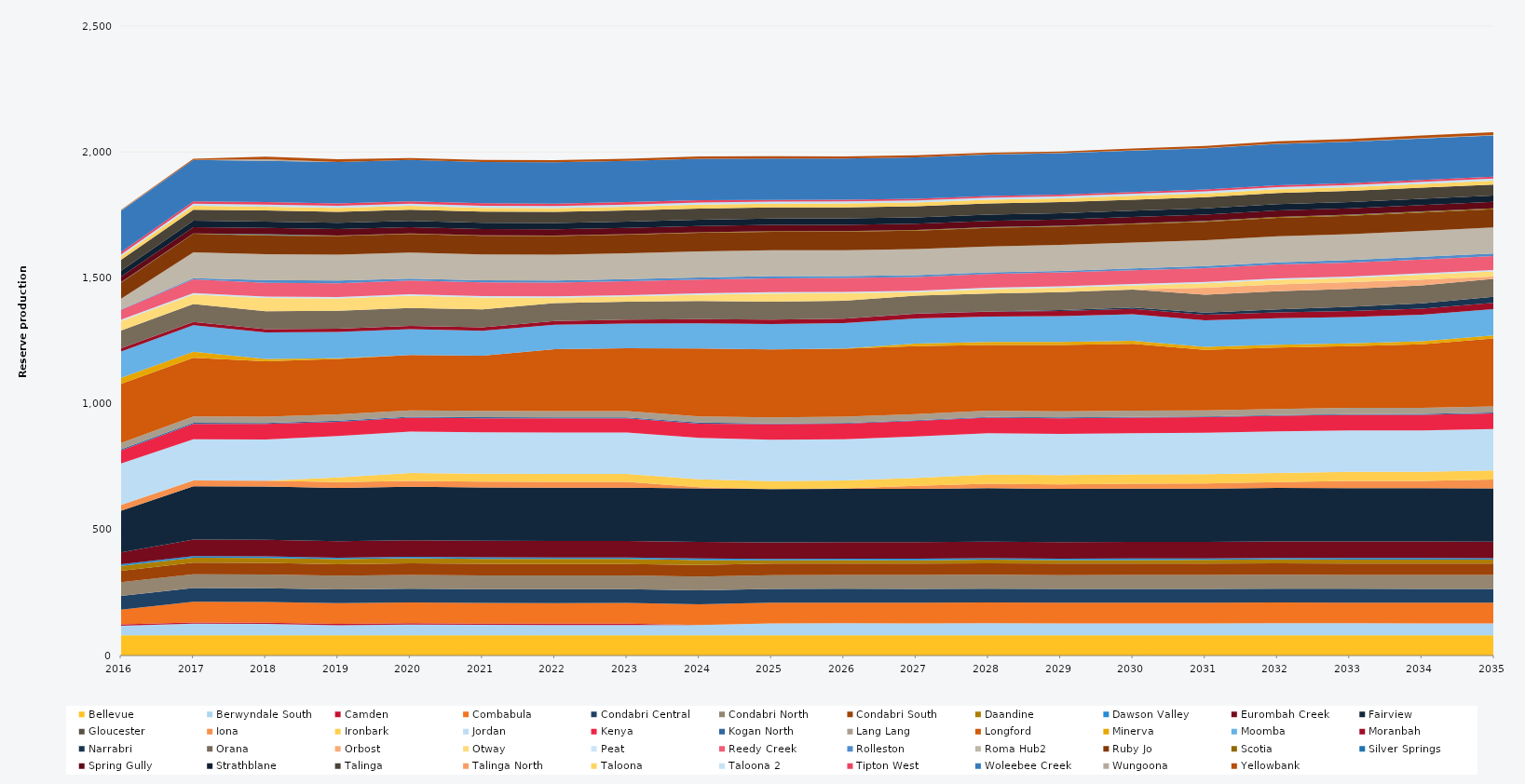
| Category | Bellevue | Berwyndale South | Camden | Combabula | Condabri Central | Condabri North | Condabri South | Daandine | Dawson Valley | Eurombah Creek | Fairview | Gloucester | Iona | Ironbark | Jordan | Kenya | Kogan North | Lang Lang | Longford | Minerva | Moomba | Moranbah | Narrabri | Orana | Orbost | Otway | Peat | Reedy Creek | Rolleston | Roma Hub2 | Ruby Jo | Scotia | Silver Springs | Spring Gully | Strathblane | Talinga | Talinga North | Taloona | Taloona 2 | Tipton West | Woleebee Creek | Wungoona | Yellowbank |
|---|---|---|---|---|---|---|---|---|---|---|---|---|---|---|---|---|---|---|---|---|---|---|---|---|---|---|---|---|---|---|---|---|---|---|---|---|---|---|---|---|---|---|---|
| 2016 | 80.52 | 37.922 | 5 | 58.915 | 54.284 | 54.305 | 45.297 | 20.13 | 5.856 | 47.429 | 165.636 | 0 | 23.12 | 0 | 164.7 | 51.692 | 4.392 | 24.522 | 235.041 | 23.79 | 105 | 12.859 | 0 | 70.525 | 0 | 38 | 5.49 | 38.171 | 2.122 | 42.169 | 64.014 | 1.196 | 0.533 | 22.691 | 23.355 | 43.324 | 0 | 13.172 | 7.637 | 9.516 | 164.7 | 1.248 | 2.042 |
| 2017 | 80.3 | 46.097 | 5 | 82.125 | 54.75 | 54.75 | 45.625 | 20.075 | 5.84 | 65.7 | 211.7 | 0 | 23.12 | 0 | 164.25 | 60.894 | 4.38 | 24.455 | 233.892 | 23.725 | 105 | 12.863 | 0 | 71.175 | 0 | 38 | 5.475 | 54.75 | 4.356 | 102.93 | 73.702 | 1.079 | 0.281 | 25.185 | 25.185 | 43.8 | 0 | 15.33 | 8.395 | 9.49 | 164.25 | 0.558 | 4.372 |
| 2018 | 80.3 | 45.072 | 5 | 82.125 | 54.75 | 54.75 | 45.625 | 20.075 | 5.84 | 65.7 | 211.7 | 0 | 23.12 | 0 | 164.25 | 61.294 | 4.38 | 24.455 | 220 | 9.902 | 105 | 13.029 | 0 | 71.175 | 0 | 52.421 | 5.475 | 54.75 | 10.847 | 102.93 | 73.702 | 3.274 | 2.393 | 25.185 | 25.185 | 43.8 | 0 | 15.33 | 8.395 | 9.49 | 164.25 | 5.912 | 10.847 |
| 2019 | 80.3 | 40.221 | 5 | 82.125 | 54.75 | 54.75 | 45.625 | 20.075 | 5.84 | 65.7 | 211.7 | 0 | 23.12 | 18.25 | 164.25 | 56.988 | 4.38 | 24.455 | 220 | 2.858 | 105 | 12.796 | 0 | 71.175 | 0 | 48.95 | 5.475 | 54.75 | 10.948 | 102.93 | 73.702 | 1.97 | 0.057 | 25.185 | 25.185 | 43.8 | 0 | 15.33 | 8.395 | 9.49 | 164.25 | 0.181 | 10.95 |
| 2020 | 80.52 | 42.627 | 5 | 82.35 | 54.9 | 54.9 | 45.75 | 20.13 | 5.856 | 65.88 | 212.28 | 0 | 23.12 | 31.587 | 164.7 | 55.021 | 4.392 | 24.522 | 220 | 0.475 | 101.977 | 12.768 | 0 | 71.37 | 0 | 48.95 | 5.49 | 54.9 | 7.565 | 103.212 | 73.873 | 1.894 | 0 | 25.254 | 25.254 | 43.92 | 0 | 15.372 | 8.418 | 9.516 | 164.7 | 0 | 7.694 |
| 2021 | 80.3 | 41.499 | 5 | 82.125 | 54.75 | 54.75 | 45.625 | 20.075 | 5.84 | 65.7 | 211.7 | 0 | 23.12 | 31.51 | 164.25 | 56.169 | 4.38 | 24.455 | 220 | 0 | 98.518 | 13.526 | 0 | 71.175 | 0 | 47.432 | 5.475 | 54.75 | 8.051 | 102.93 | 73.674 | 1.899 | 0 | 25.185 | 25.185 | 43.8 | 0 | 15.33 | 8.395 | 9.49 | 164.25 | 0.025 | 8.464 |
| 2022 | 80.3 | 40.904 | 5 | 82.125 | 54.75 | 54.75 | 45.625 | 20.075 | 5.84 | 65.7 | 211.7 | 0 | 23.12 | 31.391 | 164.25 | 56.312 | 4.38 | 24.455 | 245.927 | 0 | 96.855 | 15.305 | 0 | 71.175 | 0 | 20.942 | 5.475 | 54.75 | 8.059 | 102.93 | 73.63 | 1.838 | 0.012 | 25.185 | 25.185 | 43.8 | 0 | 15.33 | 8.395 | 9.49 | 164.25 | 0.03 | 8.171 |
| 2023 | 80.3 | 41.064 | 5 | 82.125 | 54.75 | 54.75 | 45.625 | 20.075 | 5.84 | 65.7 | 211.7 | 0 | 23.12 | 31.38 | 164.25 | 56.176 | 4.38 | 24.455 | 249.552 | 0 | 97.871 | 16.282 | 0 | 71.175 | 0 | 20.567 | 5.475 | 54.75 | 8.398 | 102.93 | 73.586 | 2.003 | 0.012 | 25.185 | 25.185 | 43.8 | 0 | 15.33 | 8.395 | 9.49 | 164.25 | 0.03 | 8.343 |
| 2024 | 80.52 | 40.852 | 0 | 82.35 | 54.9 | 54.9 | 45.75 | 20.13 | 5.856 | 65.88 | 212.28 | 0 | 5.3 | 31.066 | 164.7 | 56.147 | 4.392 | 24.522 | 270 | 0 | 99.942 | 16.806 | 0 | 71.37 | 0 | 25.228 | 5.49 | 54.9 | 8.59 | 103.212 | 73.713 | 1.875 | 0.012 | 25.254 | 25.254 | 43.92 | 0 | 15.372 | 8.418 | 9.516 | 164.7 | 0.04 | 8.667 |
| 2025 | 80.3 | 47.336 | 0 | 82.125 | 54.75 | 54.75 | 45.625 | 12.912 | 5.84 | 65.7 | 211.7 | 0 | 0 | 31.419 | 164.25 | 62.16 | 2.854 | 24.455 | 270 | 0 | 100.749 | 17.285 | 0.116 | 71.175 | 0 | 32.038 | 5.475 | 54.75 | 8.847 | 102.93 | 73.498 | 2.176 | 0.09 | 25.185 | 25.185 | 43.8 | 0 | 15.33 | 8.395 | 6.311 | 164.25 | 0.168 | 8.925 |
| 2026 | 80.3 | 47.82 | 0 | 82.125 | 54.75 | 54.75 | 45.625 | 13.359 | 5.84 | 65.7 | 211.7 | 0 | 1.657 | 31.425 | 164.25 | 61.679 | 3.058 | 24.455 | 270 | 1.226 | 100.411 | 17.534 | 0.255 | 71.175 | 0 | 30.032 | 5.475 | 54.75 | 7.695 | 102.93 | 73.455 | 2.074 | 0.048 | 25.185 | 25.185 | 43.8 | 0 | 15.33 | 8.395 | 6.459 | 164.25 | 0.206 | 7.888 |
| 2027 | 80.3 | 47.533 | 0 | 82.125 | 54.75 | 54.75 | 45.625 | 13.514 | 5.84 | 65.7 | 211.7 | 0 | 11.988 | 31.535 | 164.25 | 61.95 | 3.081 | 24.455 | 270 | 9.505 | 100.276 | 18.159 | 0.725 | 71.175 | 0 | 13.979 | 5.475 | 54.75 | 7.972 | 102.93 | 73.411 | 2.237 | 0.133 | 25.185 | 25.185 | 43.8 | 0 | 15.33 | 8.395 | 6.572 | 164.25 | 0.386 | 7.755 |
| 2028 | 80.52 | 47.8 | 0 | 82.35 | 54.9 | 54.9 | 45.75 | 14.489 | 5.856 | 65.88 | 212.28 | 0 | 17.997 | 35.754 | 164.7 | 61.978 | 2.893 | 24.522 | 261.09 | 12.109 | 100.609 | 19.008 | 1.261 | 71.37 | 0 | 16.91 | 5.49 | 54.9 | 6.236 | 103.212 | 73.537 | 2.346 | 0.149 | 25.254 | 25.254 | 43.92 | 0 | 15.372 | 8.418 | 6.131 | 164.7 | 0.484 | 6.291 |
| 2029 | 80.3 | 47.36 | 0 | 82.125 | 54.75 | 54.75 | 45.625 | 14.123 | 5.84 | 65.7 | 211.7 | 0 | 17.375 | 36.5 | 164.25 | 62.139 | 2.872 | 24.455 | 263.426 | 11.665 | 102.858 | 20.36 | 3.505 | 71.175 | 0.639 | 17.697 | 5.475 | 54.75 | 6.266 | 102.93 | 73.323 | 2.28 | 0.271 | 25.185 | 25.185 | 43.8 | 0 | 15.33 | 8.395 | 6.402 | 164.25 | 0.787 | 6.242 |
| 2030 | 80.3 | 47.68 | 0 | 82.125 | 54.75 | 54.75 | 45.625 | 14.019 | 5.84 | 65.7 | 211.7 | 0 | 20.082 | 36.5 | 164.25 | 61.82 | 2.934 | 24.455 | 265.076 | 12.613 | 105 | 21.622 | 5.326 | 71.175 | 0.73 | 15.593 | 5.475 | 54.75 | 7.203 | 102.93 | 73.279 | 2.663 | 0.428 | 25.185 | 25.185 | 43.8 | 0 | 15.33 | 8.395 | 6.691 | 164.25 | 0.977 | 7.352 |
| 2031 | 80.3 | 47.52 | 0 | 82.125 | 54.75 | 54.75 | 45.625 | 14.635 | 5.84 | 65.7 | 211.7 | 0 | 20.681 | 36.5 | 164.25 | 61.975 | 2.959 | 24.455 | 240.435 | 11.795 | 105 | 22.567 | 8.705 | 71.175 | 27.375 | 17.88 | 5.475 | 54.75 | 7.591 | 102.93 | 73.235 | 2.938 | 0.377 | 25.185 | 25.185 | 43.8 | 0 | 15.33 | 8.395 | 6.617 | 164.25 | 1.005 | 7.708 |
| 2032 | 80.52 | 47.714 | 0 | 82.35 | 54.9 | 54.9 | 45.75 | 15.484 | 5.856 | 65.88 | 212.28 | 0 | 22.993 | 36.6 | 164.7 | 62.075 | 3.032 | 24.522 | 243.268 | 11.503 | 105 | 23.484 | 12.378 | 71.37 | 27.45 | 18.474 | 5.49 | 54.9 | 9.068 | 103.212 | 73.361 | 3.208 | 0.537 | 25.254 | 25.254 | 43.92 | 0 | 15.372 | 8.418 | 6.795 | 164.7 | 1.188 | 8.971 |
| 2033 | 80.3 | 47.778 | 0 | 82.125 | 54.75 | 54.75 | 45.625 | 15.85 | 5.84 | 65.7 | 211.7 | 0 | 29.019 | 36.5 | 164.25 | 61.71 | 3.32 | 24.455 | 244.715 | 11.3 | 105 | 23.992 | 16.159 | 71.175 | 27.375 | 16.639 | 5.475 | 54.75 | 10.473 | 102.93 | 73.147 | 3.539 | 0.553 | 25.185 | 25.185 | 43.8 | 0 | 15.33 | 8.395 | 7.155 | 164.25 | 1.504 | 10.315 |
| 2034 | 80.3 | 47.58 | 0 | 82.125 | 54.75 | 54.75 | 45.625 | 15.974 | 5.84 | 65.7 | 211.7 | 0 | 29.06 | 36.5 | 164.25 | 61.911 | 3.287 | 24.455 | 252.516 | 11.769 | 105 | 24.563 | 21.553 | 71.175 | 22.975 | 19.263 | 5.475 | 54.75 | 10.79 | 102.93 | 73.103 | 3.726 | 0.635 | 25.185 | 25.185 | 43.8 | 0 | 15.33 | 8.395 | 7.25 | 164.25 | 1.463 | 10.851 |
| 2035 | 80.3 | 47.54 | 0 | 82.125 | 54.75 | 54.75 | 45.625 | 15.877 | 5.84 | 65.7 | 211.7 | 0 | 34.759 | 36.5 | 164.25 | 61.96 | 3.295 | 24.455 | 270 | 11.942 | 105 | 24.813 | 23.754 | 71.175 | 9.338 | 20.592 | 5.475 | 54.75 | 10.95 | 102.93 | 72.753 | 3.21 | 0.566 | 25.185 | 25.185 | 43.8 | 0 | 15.33 | 8.395 | 7.254 | 164.25 | 1.406 | 10.95 |